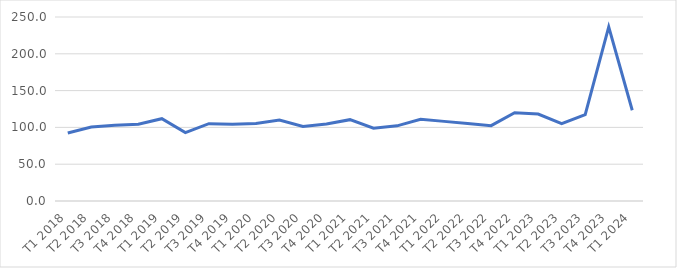
| Category | Series 0 |
|---|---|
| T1 2018 | 92.304 |
| T2 2018 | 100.419 |
| T3 2018 | 102.967 |
| T4 2018 | 104.31 |
| T1 2019 | 111.823 |
| T2 2019 | 92.921 |
| T3 2019 | 105.095 |
| T4 2019 | 104.271 |
| T1 2020 | 105.339 |
| T2 2020 | 109.944 |
| T3 2020 | 101.374 |
| T4 2020 | 104.693 |
| T1 2021 | 110.499 |
| T2 2021 | 98.837 |
| T3 2021 | 102.089 |
| T4 2021 | 110.948 |
| T1 2022 | 108.191 |
| T2 2022 | 105.254 |
| T3 2022 | 102.367 |
| T4 2022 | 119.899 |
| T1 2023 | 118.152 |
| T2 2023 | 105.254 |
| T3 2023 | 117.437 |
| T4 2023 | 236.483 |
| T1 2024 | 123.293 |